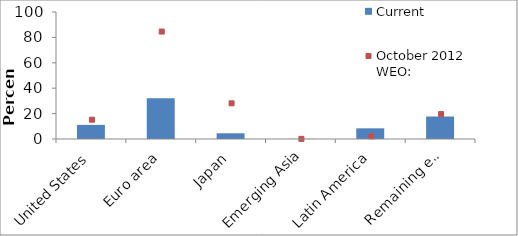
| Category | Current |
|---|---|
| United States | 11.1 |
| Euro area | 32.1 |
| Japan | 4.5 |
| Emerging Asia | 0.1 |
| Latin America | 8.4 |
| Remaining_x000d_ economies | 17.7 |